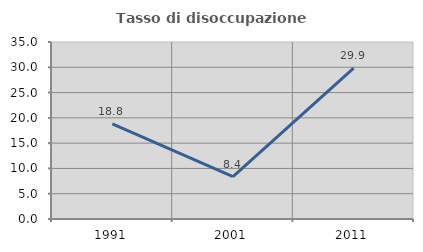
| Category | Tasso di disoccupazione giovanile  |
|---|---|
| 1991.0 | 18.8 |
| 2001.0 | 8.383 |
| 2011.0 | 29.851 |